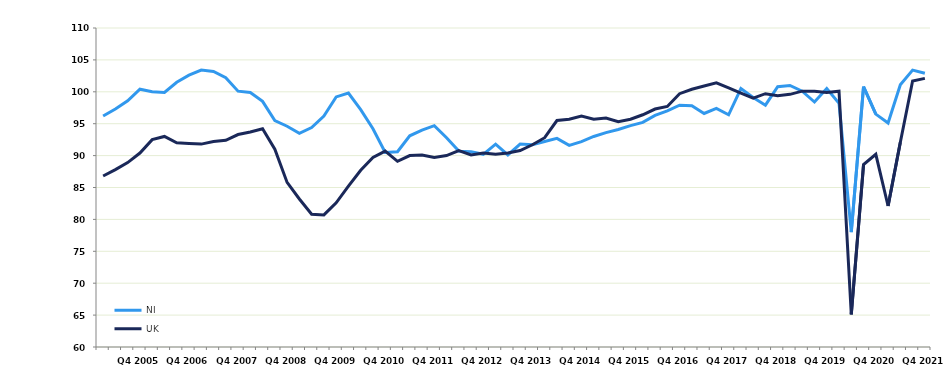
| Category | NI | UK |
|---|---|---|
|  | 96.2 | 86.8 |
|  | 97.3 | 87.8 |
|  | 98.6 | 88.9 |
| Q4 2005 | 100.4 | 90.4 |
|  | 100 | 92.5 |
|  | 99.9 | 93 |
|  | 101.5 | 92 |
| Q4 2006 | 102.6 | 91.9 |
|  | 103.4 | 91.8 |
|  | 103.2 | 92.2 |
|  | 102.2 | 92.4 |
| Q4 2007 | 100.1 | 93.3 |
|  | 99.9 | 93.7 |
|  | 98.5 | 94.2 |
|  | 95.5 | 91 |
| Q4 2008 | 94.6 | 85.8 |
|  | 93.5 | 83.2 |
|  | 94.4 | 80.8 |
|  | 96.2 | 80.7 |
| Q4 2009 | 99.2 | 82.6 |
|  | 99.8 | 85.2 |
|  | 97.2 | 87.7 |
|  | 94.2 | 89.7 |
| Q4 2010 | 90.5 | 90.7 |
|  | 90.6 | 89.1 |
|  | 93.1 | 90 |
|  | 94 | 90.1 |
| Q4 2011 | 94.7 | 89.7 |
|  | 92.8 | 90 |
|  | 90.7 | 90.8 |
|  | 90.6 | 90.1 |
| Q4 2012 | 90.2 | 90.4 |
|  | 91.8 | 90.2 |
|  | 90.1 | 90.4 |
|  | 91.8 | 90.8 |
| Q4 2013 | 91.7 | 91.7 |
|  | 92.2 | 92.8 |
|  | 92.7 | 95.5 |
|  | 91.6 | 95.7 |
| Q4 2014 | 92.2 | 96.2 |
|  | 93 | 95.7 |
|  | 93.6 | 95.9 |
|  | 94.1 | 95.3 |
| Q4 2015 | 94.7 | 95.7 |
|  | 95.2 | 96.4 |
|  | 96.3 | 97.3 |
|  | 97 | 97.7 |
| Q4 2016 | 97.9 | 99.7 |
|  | 97.8 | 100.4 |
|  | 96.6 | 100.9 |
|  | 97.4 | 101.4 |
| Q4 2017 | 96.4 | 100.6 |
|  | 100.5 | 99.8 |
|  | 99.1 | 99 |
|  | 97.9 | 99.7 |
| Q4 2018 | 100.8 | 99.4 |
|  | 101 | 99.6 |
|  | 100.1 | 100.1 |
|  | 98.4 | 100.1 |
| Q4 2019 | 100.5 | 99.9 |
|  | 98.2 | 100.1 |
|  | 78 | 65.1 |
|  | 100.8 | 88.6 |
| Q4 2020 | 96.5 | 90.2 |
|  | 95.1 | 82.1 |
|  | 101.1 | 92.1 |
|  | 103.4 | 101.7 |
| Q4 2021 | 102.9 | 102.1 |